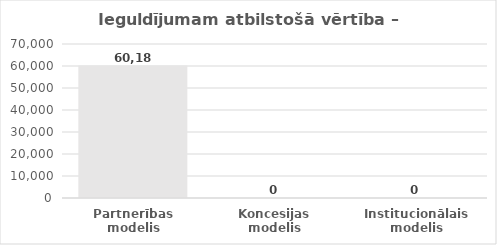
| Category | Series 0 |
|---|---|
| Partnerības modelis | 60183.959 |
| Koncesijas modelis | 0 |
| Institucionālais modelis | 0 |